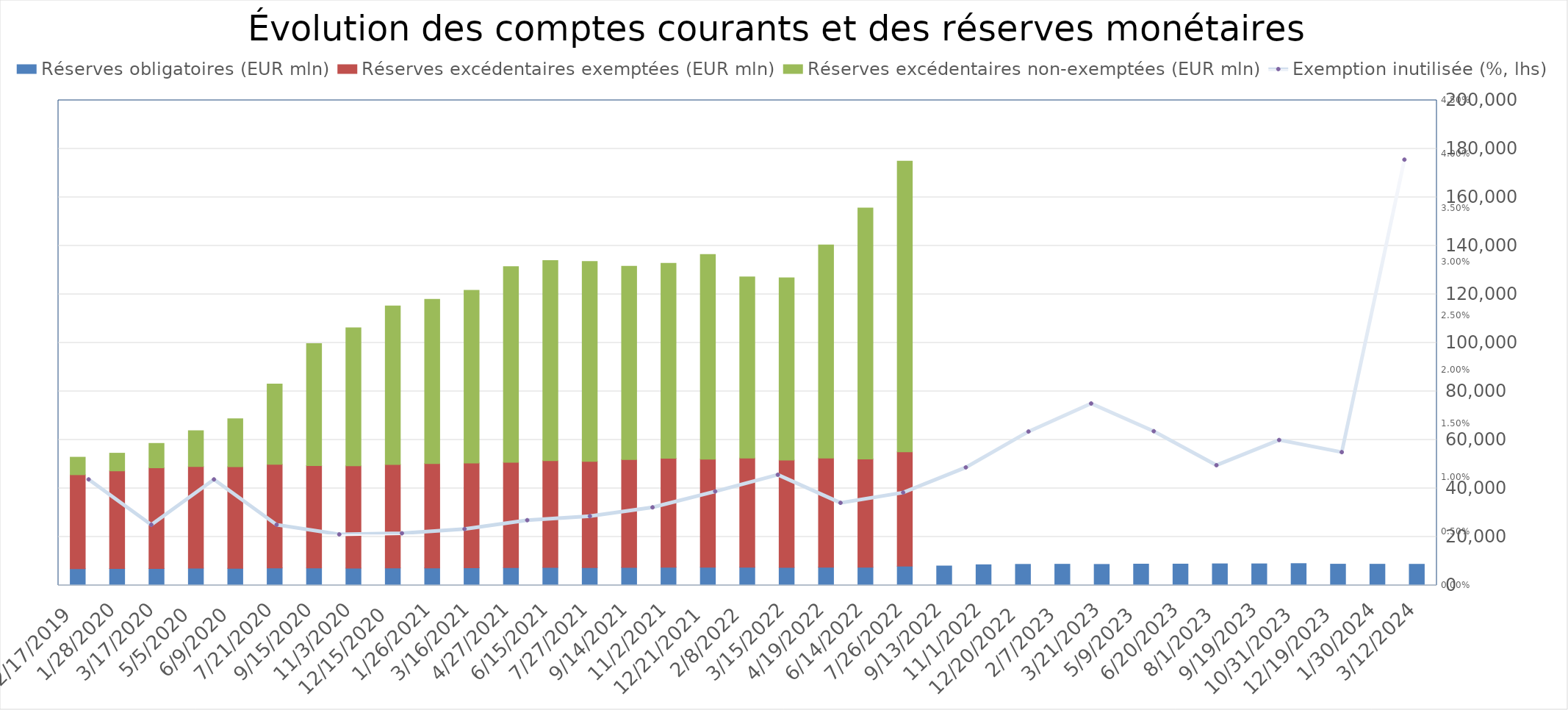
| Category | Réserves obligatoires (EUR mln) | Réserves excédentaires exemptées (EUR mln) | Réserves excédentaires non-exemptées (EUR mln) |
|---|---|---|---|
| 3/12/24 | 8722 | 0 | 0 |
| 1/30/24 | 8741.019 | 0 | 0 |
| 12/19/23 | 8762 | 0 | 0 |
| 10/31/23 | 9001 | 0 | 0 |
| 9/19/23 | 8896 | 0 | 0 |
| 8/1/23 | 8904 | 0 | 0 |
| 6/20/23 | 8799 | 0 | 0 |
| 5/9/23 | 8796 | 0 | 0 |
| 3/21/23 | 8668 | 0 | 0 |
| 2/7/23 | 8736 | 0 | 0 |
| 12/20/22 | 8689 | 0 | 0 |
| 11/1/22 | 8517 | 0 | 0 |
| 9/13/22 | 8018 | 0 | 0 |
| 7/26/22 | 7929 | 47109 | 119909 |
| 6/14/22 | 7495 | 44621 | 103454 |
| 4/19/22 | 7536 | 44962 | 87885 |
| 3/15/22 | 7409 | 44244 | 75192 |
| 2/8/22 | 7536 | 44997 | 74696 |
| 12/21/21 | 7472 | 44599 | 84381 |
| 11/2/21 | 7531 | 44914 | 80355 |
| 9/14/21 | 7460 | 44471 | 79647 |
| 7/27/21 | 7352 | 43793 | 82435 |
| 6/15/21 | 7404 | 44036 | 82520 |
| 4/27/21 | 7313 | 43430 | 80697 |
| 3/16/21 | 7254 | 43192 | 71224 |
| 1/26/21 | 7225 | 42978 | 67723 |
| 12/15/20 | 7190 | 42671 | 65344 |
| 11/3/20 | 7128 | 42161 | 56951 |
| 9/15/20 | 7165 | 42265 | 50289 |
| 7/21/20 | 7217 | 42685 | 33099 |
| 6/9/20 | 7060 | 41891 | 19741 |
| 5/5/20 | 7085 | 41937 | 14783 |
| 3/17/20 | 7002 | 41491 | 10061 |
| 1/28/20 | 6981 | 40234 | 7303 |
| 12/17/19 | 6887 | 38752 | 7220 |